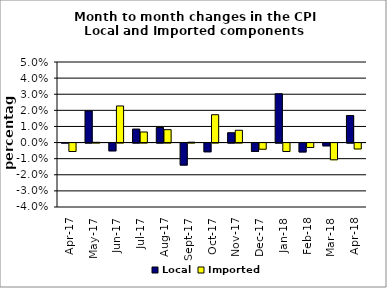
| Category | Local | Imported |
|---|---|---|
| 2017-04-01 | 0 | -0.005 |
| 2017-05-01 | 0.02 | 0 |
| 2017-06-01 | -0.005 | 0.023 |
| 2017-07-01 | 0.008 | 0.007 |
| 2017-08-01 | 0.009 | 0.008 |
| 2017-09-01 | -0.014 | 0 |
| 2017-10-01 | -0.005 | 0.017 |
| 2017-11-01 | 0.006 | 0.008 |
| 2017-12-01 | -0.005 | -0.004 |
| 2018-01-01 | 0.03 | -0.005 |
| 2018-02-01 | -0.006 | -0.003 |
| 2018-03-01 | -0.002 | -0.01 |
| 2018-04-01 | 0.017 | -0.004 |